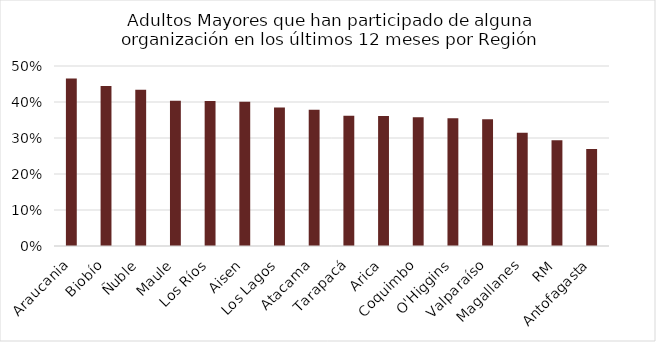
| Category | Adultos Mayores |
|---|---|
| Araucania | 0.465 |
| Biobío | 0.444 |
| Ñuble | 0.434 |
| Maule | 0.404 |
| Los Ríos | 0.403 |
| Aisen | 0.401 |
| Los Lagos | 0.385 |
| Atacama | 0.378 |
| Tarapacá | 0.362 |
| Arica | 0.361 |
| Coquimbo | 0.358 |
| O'Higgins | 0.355 |
| Valparaíso | 0.352 |
| Magallanes | 0.315 |
| RM | 0.294 |
| Antofagasta | 0.269 |